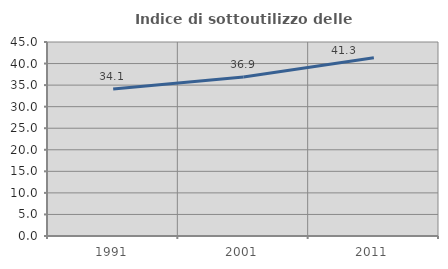
| Category | Indice di sottoutilizzo delle abitazioni  |
|---|---|
| 1991.0 | 34.125 |
| 2001.0 | 36.891 |
| 2011.0 | 41.324 |